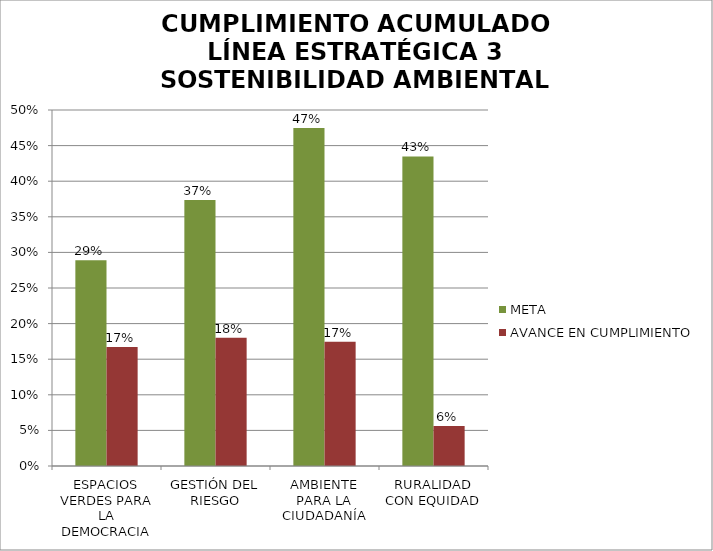
| Category | META | AVANCE EN CUMPLIMIENTO |
|---|---|---|
| ESPACIOS VERDES PARA LA DEMOCRACIA | 0.289 | 0.167 |
| GESTIÓN DEL RIESGO | 0.373 | 0.18 |
| AMBIENTE PARA LA CIUDADANÍA | 0.475 | 0.175 |
| RURALIDAD CON EQUIDAD | 0.435 | 0.056 |